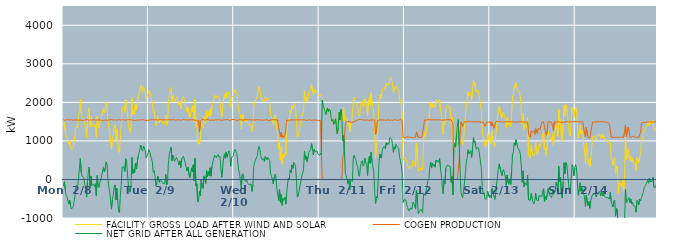
| Category | FACILITY GROSS LOAD AFTER WIND AND SOLAR | COGEN PRODUCTION | NET GRID AFTER ALL GENERATION |
|---|---|---|---|
|  Mon  2/8 | 1379 | 1553 | -174 |
|  Mon  2/8 | 1480 | 1535 | -55 |
|  Mon  2/8 | 1272 | 1531 | -259 |
|  Mon  2/8 | 1136 | 1557 | -421 |
|  Mon  2/8 | 1092 | 1541 | -449 |
|  Mon  2/8 | 1010 | 1545 | -535 |
|  Mon  2/8 | 920 | 1555 | -635 |
|  Mon  2/8 | 1010 | 1546 | -536 |
|  Mon  2/8 | 850 | 1536 | -686 |
|  Mon  2/8 | 784 | 1550 | -766 |
|  Mon  2/8 | 798 | 1537 | -739 |
|  Mon  2/8 | 828 | 1534 | -706 |
|  Mon  2/8 | 973 | 1539 | -566 |
|  Mon  2/8 | 1138 | 1548 | -410 |
|  Mon  2/8 | 1354 | 1543 | -189 |
|  Mon  2/8 | 1389 | 1541 | -152 |
|  Mon  2/8 | 1340 | 1537 | -197 |
|  Mon  2/8 | 1328 | 1538 | -210 |
|  Mon  2/8 | 1835 | 1543 | 292 |
|  Mon  2/8 | 2080 | 1539 | 541 |
|  Mon  2/8 | 1721 | 1541 | 180 |
|  Mon  2/8 | 1622 | 1533 | 89 |
|  Mon  2/8 | 1616 | 1546 | 70 |
|  Mon  2/8 | 1577 | 1534 | 43 |
|  Mon  2/8 | 1405 | 1535 | -130 |
|  Mon  2/8 | 1327 | 1550 | -223 |
|  Mon  2/8 | 1082 | 1540 | -458 |
|  Mon  2/8 | 1476 | 1552 | -76 |
|  Mon  2/8 | 1740 | 1553 | 187 |
|  Mon  2/8 | 1849 | 1528 | 321 |
|  Mon  2/8 | 1372 | 1555 | -183 |
|  Mon  2/8 | 1627 | 1546 | 81 |
|  Mon  2/8 | 1375 | 1535 | -160 |
|  Mon  2/8 | 1396 | 1543 | -147 |
|  Mon  2/8 | 1431 | 1554 | -123 |
|  Mon  2/8 | 1364 | 1547 | -183 |
|  Mon  2/8 | 1428 | 1537 | -109 |
|  Mon  2/8 | 1096 | 1527 | -431 |
|  Mon  2/8 | 1643 | 1541 | 102 |
|  Mon  2/8 | 1372 | 1534 | -162 |
|  Mon  2/8 | 1335 | 1546 | -211 |
|  Mon  2/8 | 1461 | 1543 | -82 |
|  Mon  2/8 | 1531 | 1540 | -9 |
|  Mon  2/8 | 1669 | 1556 | 113 |
|  Mon  2/8 | 1724 | 1530 | 194 |
|  Mon  2/8 | 1847 | 1541 | 306 |
|  Mon  2/8 | 1735 | 1540 | 195 |
|  Mon  2/8 | 1843 | 1542 | 301 |
|  Mon  2/8 | 1996 | 1540 | 456 |
|  Mon  2/8 | 1912 | 1540 | 372 |
|  Mon  2/8 | 1551 | 1536 | 15 |
|  Mon  2/8 | 1358 | 1554 | -196 |
|  Mon  2/8 | 1243 | 1547 | -304 |
|  Mon  2/8 | 996 | 1547 | -551 |
|  Mon  2/8 | 781 | 1552 | -771 |
|  Mon  2/8 | 1016 | 1539 | -523 |
|  Mon  2/8 | 1131 | 1541 | -410 |
|  Mon  2/8 | 1335 | 1536 | -201 |
|  Mon  2/8 | 1406 | 1547 | -141 |
|  Mon  2/8 | 1015 | 1545 | -530 |
|  Mon  2/8 | 1308 | 1536 | -228 |
|  Mon  2/8 | 996 | 1543 | -547 |
|  Mon  2/8 | 732 | 1555 | -823 |
|  Mon  2/8 | 691 | 1549 | -858 |
|  Mon  2/8 | 1128 | 1541 | -413 |
|  Mon  2/8 | 1404 | 1537 | -133 |
|  Mon  2/8 | 1860 | 1549 | 311 |
|  Mon  2/8 | 1869 | 1550 | 319 |
|  Mon  2/8 | 1883 | 1547 | 336 |
|  Mon  2/8 | 1744 | 1540 | 204 |
|  Mon  2/8 | 2075 | 1536 | 539 |
|  Mon  2/8 | 1993 | 1539 | 454 |
|  Mon  2/8 | 1999 | 1551 | 448 |
|  Mon  2/8 | 1416 | 1541 | -125 |
|  Mon  2/8 | 1419 | 1551 | -132 |
|  Mon  2/8 | 1219 | 1547 | -328 |
|  Mon  2/8 | 1371 | 1545 | -174 |
|  Mon  2/8 | 2116 | 1543 | 573 |
|  Mon  2/8 | 1685 | 1542 | 143 |
|  Mon  2/8 | 1796 | 1541 | 255 |
|  Mon  2/8 | 1699 | 1530 | 169 |
|  Mon  2/8 | 1960 | 1547 | 413 |
|  Mon  2/8 | 1810 | 1534 | 276 |
|  Mon  2/8 | 1808 | 1547 | 261 |
|  Mon  2/8 | 2143 | 1546 | 597 |
|  Mon  2/8 | 2136 | 1531 | 605 |
|  Mon  2/8 | 2323 | 1539 | 784 |
|  Mon  2/8 | 2440 | 1547 | 893 |
|  Mon  2/8 | 2339 | 1549 | 790 |
|  Mon  2/8 | 2261 | 1529 | 732 |
|  Mon  2/8 | 2412 | 1547 | 865 |
|  Mon  2/8 | 2355 | 1553 | 802 |
|  Mon  2/8 | 2275 | 1535 | 740 |
|  Mon  2/8 | 2111 | 1551 | 560 |
|  Mon  2/8 | 2110 | 1531 | 579 |
|  Mon  2/8 | 2202 | 1540 | 662 |
|  Tue  2/9 | 2317 | 1540 | 777 |
|  Tue  2/9 | 2267 | 1557 | 710 |
|  Tue  2/9 | 2254 | 1545 | 709 |
|  Tue  2/9 | 2094 | 1546 | 548 |
|  Tue  2/9 | 2004 | 1552 | 452 |
|  Tue  2/9 | 1727 | 1541 | 186 |
|  Tue  2/9 | 1776 | 1549 | 227 |
|  Tue  2/9 | 1618 | 1543 | 75 |
|  Tue  2/9 | 1388 | 1551 | -163 |
|  Tue  2/9 | 1447 | 1538 | -91 |
|  Tue  2/9 | 1632 | 1543 | 89 |
|  Tue  2/9 | 1642 | 1548 | 94 |
|  Tue  2/9 | 1474 | 1550 | -76 |
|  Tue  2/9 | 1539 | 1545 | -6 |
|  Tue  2/9 | 1517 | 1549 | -32 |
|  Tue  2/9 | 1510 | 1541 | -31 |
|  Tue  2/9 | 1439 | 1547 | -108 |
|  Tue  2/9 | 1460 | 1545 | -85 |
|  Tue  2/9 | 1451 | 1550 | -99 |
|  Tue  2/9 | 1669 | 1539 | 130 |
|  Tue  2/9 | 1400 | 1543 | -143 |
|  Tue  2/9 | 1448 | 1536 | -88 |
|  Tue  2/9 | 1955 | 1548 | 407 |
|  Tue  2/9 | 2182 | 1536 | 646 |
|  Tue  2/9 | 2181 | 1551 | 630 |
|  Tue  2/9 | 2385 | 1554 | 831 |
|  Tue  2/9 | 2028 | 1544 | 484 |
|  Tue  2/9 | 2179 | 1543 | 636 |
|  Tue  2/9 | 2094 | 1558 | 536 |
|  Tue  2/9 | 2009 | 1539 | 470 |
|  Tue  2/9 | 2014 | 1535 | 479 |
|  Tue  2/9 | 2114 | 1540 | 574 |
|  Tue  2/9 | 2144 | 1547 | 597 |
|  Tue  2/9 | 1998 | 1535 | 463 |
|  Tue  2/9 | 1924 | 1549 | 375 |
|  Tue  2/9 | 2025 | 1541 | 484 |
|  Tue  2/9 | 1845 | 1536 | 309 |
|  Tue  2/9 | 2077 | 1538 | 539 |
|  Tue  2/9 | 2110 | 1554 | 556 |
|  Tue  2/9 | 2149 | 1544 | 605 |
|  Tue  2/9 | 2131 | 1550 | 581 |
|  Tue  2/9 | 1961 | 1542 | 419 |
|  Tue  2/9 | 1982 | 1545 | 437 |
|  Tue  2/9 | 1754 | 1537 | 217 |
|  Tue  2/9 | 1864 | 1540 | 324 |
|  Tue  2/9 | 1850 | 1536 | 314 |
|  Tue  2/9 | 1590 | 1548 | 42 |
|  Tue  2/9 | 1690 | 1543 | 147 |
|  Tue  2/9 | 1845 | 1544 | 301 |
|  Tue  2/9 | 1756 | 1554 | 202 |
|  Tue  2/9 | 1930 | 1548 | 382 |
|  Tue  2/9 | 1499 | 1538 | -39 |
|  Tue  2/9 | 2088 | 1537 | 551 |
|  Tue  2/9 | 1386 | 1548 | -162 |
|  Tue  2/9 | 1413 | 1525 | -112 |
|  Tue  2/9 | 904 | 1491 | -587 |
|  Tue  2/9 | 1026 | 1535 | -509 |
|  Tue  2/9 | 928 | 1239 | -311 |
|  Tue  2/9 | 1082 | 1499 | -417 |
|  Tue  2/9 | 1524 | 1541 | -17 |
|  Tue  2/9 | 1376 | 1543 | -167 |
|  Tue  2/9 | 1331 | 1560 | -229 |
|  Tue  2/9 | 1633 | 1540 | 93 |
|  Tue  2/9 | 1531 | 1537 | -6 |
|  Tue  2/9 | 1443 | 1548 | -105 |
|  Tue  2/9 | 1783 | 1554 | 229 |
|  Tue  2/9 | 1619 | 1550 | 69 |
|  Tue  2/9 | 1761 | 1552 | 209 |
|  Tue  2/9 | 1640 | 1539 | 101 |
|  Tue  2/9 | 1836 | 1533 | 303 |
|  Tue  2/9 | 1637 | 1552 | 85 |
|  Tue  2/9 | 1899 | 1543 | 356 |
|  Tue  2/9 | 1985 | 1530 | 455 |
|  Tue  2/9 | 2073 | 1531 | 542 |
|  Tue  2/9 | 2185 | 1553 | 632 |
|  Tue  2/9 | 2137 | 1549 | 588 |
|  Tue  2/9 | 2108 | 1549 | 559 |
|  Tue  2/9 | 2170 | 1547 | 623 |
|  Tue  2/9 | 2188 | 1537 | 651 |
|  Tue  2/9 | 2132 | 1551 | 581 |
|  Tue  2/9 | 2149 | 1542 | 607 |
|  Tue  2/9 | 1853 | 1535 | 318 |
|  Tue  2/9 | 1605 | 1546 | 59 |
|  Tue  2/9 | 1829 | 1539 | 290 |
|  Tue  2/9 | 2073 | 1536 | 537 |
|  Tue  2/9 | 2212 | 1549 | 663 |
|  Tue  2/9 | 2093 | 1545 | 548 |
|  Tue  2/9 | 2264 | 1549 | 715 |
|  Tue  2/9 | 2123 | 1545 | 578 |
|  Tue  2/9 | 2212 | 1556 | 656 |
|  Tue  2/9 | 2281 | 1542 | 739 |
|  Tue  2/9 | 2222 | 1526 | 696 |
|  Tue  2/9 | 1871 | 1528 | 343 |
|  Tue  2/9 | 2123 | 1555 | 568 |
|  Tue  2/9 | 2114 | 1539 | 575 |
|  Tue  2/9 | 2161 | 1556 | 605 |
|  Wed  2/10 | 2282 | 1550 | 732 |
|  Wed  2/10 | 2340 | 1560 | 780 |
|  Wed  2/10 | 2316 | 1533 | 783 |
|  Wed  2/10 | 2226 | 1553 | 673 |
|  Wed  2/10 | 2007 | 1538 | 469 |
|  Wed  2/10 | 1795 | 1541 | 254 |
|  Wed  2/10 | 1711 | 1554 | 157 |
|  Wed  2/10 | 1678 | 1542 | 136 |
|  Wed  2/10 | 1309 | 1545 | -236 |
|  Wed  2/10 | 1666 | 1541 | 125 |
|  Wed  2/10 | 1699 | 1543 | 156 |
|  Wed  2/10 | 1555 | 1545 | 10 |
|  Wed  2/10 | 1536 | 1550 | -14 |
|  Wed  2/10 | 1493 | 1545 | -52 |
|  Wed  2/10 | 1562 | 1556 | 6 |
|  Wed  2/10 | 1456 | 1552 | -96 |
|  Wed  2/10 | 1460 | 1545 | -85 |
|  Wed  2/10 | 1413 | 1552 | -139 |
|  Wed  2/10 | 1398 | 1559 | -161 |
|  Wed  2/10 | 1416 | 1533 | -117 |
|  Wed  2/10 | 1242 | 1552 | -310 |
|  Wed  2/10 | 1397 | 1551 | -154 |
|  Wed  2/10 | 1881 | 1545 | 336 |
|  Wed  2/10 | 1982 | 1538 | 444 |
|  Wed  2/10 | 2058 | 1550 | 508 |
|  Wed  2/10 | 2072 | 1553 | 519 |
|  Wed  2/10 | 2156 | 1545 | 611 |
|  Wed  2/10 | 2316 | 1541 | 775 |
|  Wed  2/10 | 2410 | 1554 | 856 |
|  Wed  2/10 | 2326 | 1548 | 778 |
|  Wed  2/10 | 2134 | 1531 | 603 |
|  Wed  2/10 | 2055 | 1541 | 514 |
|  Wed  2/10 | 2066 | 1533 | 533 |
|  Wed  2/10 | 2075 | 1535 | 540 |
|  Wed  2/10 | 2012 | 1542 | 470 |
|  Wed  2/10 | 2141 | 1545 | 596 |
|  Wed  2/10 | 2105 | 1541 | 564 |
|  Wed  2/10 | 2059 | 1550 | 509 |
|  Wed  2/10 | 2114 | 1548 | 566 |
|  Wed  2/10 | 2068 | 1527 | 541 |
|  Wed  2/10 | 2010 | 1526 | 484 |
|  Wed  2/10 | 1675 | 1540 | 135 |
|  Wed  2/10 | 1613 | 1536 | 77 |
|  Wed  2/10 | 1544 | 1552 | -8 |
|  Wed  2/10 | 1422 | 1538 | -116 |
|  Wed  2/10 | 1600 | 1550 | 50 |
|  Wed  2/10 | 1680 | 1543 | 137 |
|  Wed  2/10 | 1594 | 1546 | 48 |
|  Wed  2/10 | 1302 | 1548 | -246 |
|  Wed  2/10 | 1167 | 1547 | -380 |
|  Wed  2/10 | 795 | 1341 | -546 |
|  Wed  2/10 | 989 | 1243 | -254 |
|  Wed  2/10 | 503 | 1100 | -597 |
|  Wed  2/10 | 843 | 1225 | -382 |
|  Wed  2/10 | 416 | 1088 | -672 |
|  Wed  2/10 | 636 | 1132 | -496 |
|  Wed  2/10 | 577 | 1101 | -524 |
|  Wed  2/10 | 691 | 1151 | -460 |
|  Wed  2/10 | 632 | 1272 | -640 |
|  Wed  2/10 | 1165 | 1540 | -375 |
|  Wed  2/10 | 1426 | 1542 | -116 |
|  Wed  2/10 | 1576 | 1537 | 39 |
|  Wed  2/10 | 1548 | 1550 | -2 |
|  Wed  2/10 | 1788 | 1540 | 248 |
|  Wed  2/10 | 1722 | 1544 | 178 |
|  Wed  2/10 | 1924 | 1547 | 377 |
|  Wed  2/10 | 1823 | 1535 | 288 |
|  Wed  2/10 | 1982 | 1543 | 439 |
|  Wed  2/10 | 1943 | 1550 | 393 |
|  Wed  2/10 | 1886 | 1545 | 341 |
|  Wed  2/10 | 1538 | 1547 | -9 |
|  Wed  2/10 | 1087 | 1547 | -460 |
|  Wed  2/10 | 1121 | 1552 | -431 |
|  Wed  2/10 | 1113 | 1546 | -433 |
|  Wed  2/10 | 1380 | 1544 | -164 |
|  Wed  2/10 | 1402 | 1545 | -143 |
|  Wed  2/10 | 1628 | 1546 | 82 |
|  Wed  2/10 | 1640 | 1545 | 95 |
|  Wed  2/10 | 1781 | 1538 | 243 |
|  Wed  2/10 | 2286 | 1547 | 739 |
|  Wed  2/10 | 2053 | 1532 | 521 |
|  Wed  2/10 | 2144 | 1537 | 607 |
|  Wed  2/10 | 2011 | 1547 | 464 |
|  Wed  2/10 | 2118 | 1536 | 582 |
|  Wed  2/10 | 2254 | 1552 | 702 |
|  Wed  2/10 | 2255 | 1549 | 706 |
|  Wed  2/10 | 2329 | 1552 | 777 |
|  Wed  2/10 | 2460 | 1533 | 927 |
|  Wed  2/10 | 2335 | 1549 | 786 |
|  Wed  2/10 | 2180 | 1543 | 637 |
|  Wed  2/10 | 2333 | 1550 | 783 |
|  Wed  2/10 | 2263 | 1537 | 726 |
|  Wed  2/10 | 2283 | 1552 | 731 |
|  Wed  2/10 | 2281 | 1540 | 741 |
|  Wed  2/10 | 2208 | 1543 | 665 |
|  Wed  2/10 | 2176 | 1528 | 648 |
|  Thu  2/11 | 2168 | 1549 | 619 |
|  Thu  2/11 | 2210 | 1532 | 678 |
|  Thu  2/11 | 2163 | 1523 | 640 |
|  Thu  2/11 | 2058 | 0 | 2058 |
|  Thu  2/11 | 1917 | 0 | 1917 |
|  Thu  2/11 | 1895 | 0 | 1895 |
|  Thu  2/11 | 1784 | 0 | 1784 |
|  Thu  2/11 | 1682 | 0 | 1682 |
|  Thu  2/11 | 1678 | 0 | 1678 |
|  Thu  2/11 | 1855 | 0 | 1855 |
|  Thu  2/11 | 1750 | 0 | 1750 |
|  Thu  2/11 | 1824 | 0 | 1824 |
|  Thu  2/11 | 1798 | 0 | 1798 |
|  Thu  2/11 | 1606 | 0 | 1606 |
|  Thu  2/11 | 1506 | 0 | 1506 |
|  Thu  2/11 | 1562 | 0 | 1562 |
|  Thu  2/11 | 1431 | 0 | 1431 |
|  Thu  2/11 | 1502 | 0 | 1502 |
|  Thu  2/11 | 1580 | 0 | 1580 |
|  Thu  2/11 | 1602 | 0 | 1602 |
|  Thu  2/11 | 1181 | 0 | 1181 |
|  Thu  2/11 | 1351 | 0 | 1351 |
|  Thu  2/11 | 1746 | 0 | 1746 |
|  Thu  2/11 | 1540 | 0 | 1540 |
|  Thu  2/11 | 1815 | 0 | 1815 |
|  Thu  2/11 | 1699 | 0 | 1699 |
|  Thu  2/11 | 1507 | 500 | 1007 |
|  Thu  2/11 | 1879 | 745 | 1134 |
|  Thu  2/11 | 1523 | 744 | 779 |
|  Thu  2/11 | 1600 | 1438 | 162 |
|  Thu  2/11 | 1591 | 1493 | 98 |
|  Thu  2/11 | 1595 | 1487 | 108 |
|  Thu  2/11 | 1387 | 1497 | -110 |
|  Thu  2/11 | 1471 | 1477 | -6 |
|  Thu  2/11 | 1235 | 1495 | -260 |
|  Thu  2/11 | 1464 | 1497 | -33 |
|  Thu  2/11 | 1426 | 1481 | -55 |
|  Thu  2/11 | 1443 | 1492 | -49 |
|  Thu  2/11 | 2082 | 1494 | 588 |
|  Thu  2/11 | 2126 | 1496 | 630 |
|  Thu  2/11 | 2048 | 1505 | 543 |
|  Thu  2/11 | 1994 | 1490 | 504 |
|  Thu  2/11 | 1920 | 1538 | 382 |
|  Thu  2/11 | 1846 | 1530 | 316 |
|  Thu  2/11 | 1665 | 1548 | 117 |
|  Thu  2/11 | 1628 | 1549 | 79 |
|  Thu  2/11 | 1897 | 1558 | 339 |
|  Thu  2/11 | 1993 | 1548 | 445 |
|  Thu  2/11 | 2035 | 1548 | 487 |
|  Thu  2/11 | 1884 | 1542 | 342 |
|  Thu  2/11 | 1920 | 1539 | 381 |
|  Thu  2/11 | 2103 | 1548 | 555 |
|  Thu  2/11 | 1967 | 1538 | 429 |
|  Thu  2/11 | 1940 | 1545 | 395 |
|  Thu  2/11 | 1649 | 1545 | 104 |
|  Thu  2/11 | 2017 | 1536 | 481 |
|  Thu  2/11 | 2139 | 1532 | 607 |
|  Thu  2/11 | 1945 | 1529 | 416 |
|  Thu  2/11 | 2246 | 1543 | 703 |
|  Thu  2/11 | 1994 | 1538 | 456 |
|  Thu  2/11 | 1875 | 1542 | 333 |
|  Thu  2/11 | 1714 | 1543 | 171 |
|  Thu  2/11 | 1243 | 1548 | -305 |
|  Thu  2/11 | 540 | 1164 | -624 |
|  Thu  2/11 | 795 | 1240 | -445 |
|  Thu  2/11 | 1041 | 1521 | -480 |
|  Thu  2/11 | 1580 | 1546 | 34 |
|  Thu  2/11 | 2031 | 1541 | 490 |
|  Thu  2/11 | 2205 | 1545 | 660 |
|  Thu  2/11 | 2103 | 1547 | 556 |
|  Thu  2/11 | 2219 | 1560 | 659 |
|  Thu  2/11 | 2349 | 1542 | 807 |
|  Thu  2/11 | 2371 | 1540 | 831 |
|  Thu  2/11 | 2403 | 1543 | 860 |
|  Thu  2/11 | 2336 | 1537 | 799 |
|  Thu  2/11 | 2486 | 1535 | 951 |
|  Thu  2/11 | 2439 | 1542 | 897 |
|  Thu  2/11 | 2498 | 1549 | 949 |
|  Thu  2/11 | 2456 | 1542 | 914 |
|  Thu  2/11 | 2623 | 1535 | 1088 |
|  Thu  2/11 | 2654 | 1546 | 1108 |
|  Thu  2/11 | 2582 | 1538 | 1044 |
|  Thu  2/11 | 2475 | 1542 | 933 |
|  Thu  2/11 | 2241 | 1536 | 705 |
|  Thu  2/11 | 2394 | 1546 | 848 |
|  Thu  2/11 | 2340 | 1553 | 787 |
|  Thu  2/11 | 2439 | 1530 | 909 |
|  Thu  2/11 | 2393 | 1535 | 858 |
|  Thu  2/11 | 2371 | 1543 | 828 |
|  Thu  2/11 | 2333 | 1537 | 796 |
|  Thu  2/11 | 2118 | 1550 | 568 |
|  Thu  2/11 | 2039 | 1553 | 486 |
|  Thu  2/11 | 1895 | 1543 | 352 |
|  Thu  2/11 | 1669 | 1530 | 139 |
|  Thu  2/11 | 496 | 1093 | -597 |
|  Thu  2/11 | 563 | 1092 | -529 |
|  Fri  2/12 | 546 | 1085 | -539 |
|  Fri  2/12 | 555 | 1085 | -530 |
|  Fri  2/12 | 457 | 1105 | -648 |
|  Fri  2/12 | 371 | 1096 | -725 |
|  Fri  2/12 | 312 | 1102 | -790 |
|  Fri  2/12 | 272 | 1091 | -819 |
|  Fri  2/12 | 349 | 1091 | -742 |
|  Fri  2/12 | 353 | 1089 | -736 |
|  Fri  2/12 | 316 | 1091 | -775 |
|  Fri  2/12 | 503 | 1088 | -585 |
|  Fri  2/12 | 462 | 1079 | -617 |
|  Fri  2/12 | 462 | 1101 | -639 |
|  Fri  2/12 | 327 | 1090 | -763 |
|  Fri  2/12 | 943 | 1232 | -289 |
|  Fri  2/12 | 747 | 1222 | -475 |
|  Fri  2/12 | 218 | 1100 | -882 |
|  Fri  2/12 | 259 | 1095 | -836 |
|  Fri  2/12 | 231 | 1088 | -857 |
|  Fri  2/12 | 308 | 1081 | -773 |
|  Fri  2/12 | 301 | 1097 | -796 |
|  Fri  2/12 | 243 | 1097 | -854 |
|  Fri  2/12 | 990 | 1348 | -358 |
|  Fri  2/12 | 1207 | 1548 | -341 |
|  Fri  2/12 | 1122 | 1541 | -419 |
|  Fri  2/12 | 1127 | 1538 | -411 |
|  Fri  2/12 | 1398 | 1545 | -147 |
|  Fri  2/12 | 1542 | 1553 | -11 |
|  Fri  2/12 | 1570 | 1542 | 28 |
|  Fri  2/12 | 1861 | 1549 | 312 |
|  Fri  2/12 | 2000 | 1551 | 449 |
|  Fri  2/12 | 1843 | 1547 | 296 |
|  Fri  2/12 | 1965 | 1542 | 423 |
|  Fri  2/12 | 1897 | 1550 | 347 |
|  Fri  2/12 | 1938 | 1549 | 389 |
|  Fri  2/12 | 1865 | 1547 | 318 |
|  Fri  2/12 | 2056 | 1552 | 504 |
|  Fri  2/12 | 2005 | 1546 | 459 |
|  Fri  2/12 | 2035 | 1542 | 493 |
|  Fri  2/12 | 1989 | 1549 | 440 |
|  Fri  2/12 | 2076 | 1531 | 545 |
|  Fri  2/12 | 1840 | 1543 | 297 |
|  Fri  2/12 | 1634 | 1539 | 95 |
|  Fri  2/12 | 1369 | 1539 | -170 |
|  Fri  2/12 | 1163 | 1537 | -374 |
|  Fri  2/12 | 1515 | 1542 | -27 |
|  Fri  2/12 | 1433 | 1544 | -111 |
|  Fri  2/12 | 1831 | 1543 | 288 |
|  Fri  2/12 | 1823 | 1548 | 275 |
|  Fri  2/12 | 1932 | 1553 | 379 |
|  Fri  2/12 | 1892 | 1542 | 350 |
|  Fri  2/12 | 1887 | 1547 | 340 |
|  Fri  2/12 | 1869 | 1535 | 334 |
|  Fri  2/12 | 1476 | 1551 | -75 |
|  Fri  2/12 | 1617 | 1541 | 76 |
|  Fri  2/12 | 1052 | 1450 | -398 |
|  Fri  2/12 | 811 | 0 | 811 |
|  Fri  2/12 | 934 | 0 | 934 |
|  Fri  2/12 | 836 | 0 | 836 |
|  Fri  2/12 | 1145 | 0 | 1145 |
|  Fri  2/12 | 1378 | 0 | 1378 |
|  Fri  2/12 | 1551 | 0 | 1551 |
|  Fri  2/12 | 1384 | 488 | 896 |
|  Fri  2/12 | 1374 | 1091 | 283 |
|  Fri  2/12 | 1164 | 1493 | -329 |
|  Fri  2/12 | 1079 | 1499 | -420 |
|  Fri  2/12 | 914 | 1382 | -468 |
|  Fri  2/12 | 1003 | 1452 | -449 |
|  Fri  2/12 | 1419 | 1502 | -83 |
|  Fri  2/12 | 1644 | 1496 | 148 |
|  Fri  2/12 | 1921 | 1488 | 433 |
|  Fri  2/12 | 2055 | 1496 | 559 |
|  Fri  2/12 | 2277 | 1506 | 771 |
|  Fri  2/12 | 2162 | 1495 | 667 |
|  Fri  2/12 | 2218 | 1502 | 716 |
|  Fri  2/12 | 2248 | 1506 | 742 |
|  Fri  2/12 | 2063 | 1494 | 569 |
|  Fri  2/12 | 2290 | 1497 | 793 |
|  Fri  2/12 | 2583 | 1497 | 1086 |
|  Fri  2/12 | 2433 | 1492 | 941 |
|  Fri  2/12 | 2490 | 1499 | 991 |
|  Fri  2/12 | 2279 | 1495 | 784 |
|  Fri  2/12 | 2256 | 1481 | 775 |
|  Fri  2/12 | 2322 | 1489 | 833 |
|  Fri  2/12 | 2309 | 1515 | 794 |
|  Fri  2/12 | 2119 | 1484 | 635 |
|  Fri  2/12 | 2121 | 1482 | 639 |
|  Fri  2/12 | 1764 | 1485 | 279 |
|  Fri  2/12 | 1278 | 1496 | -218 |
|  Fri  2/12 | 1111 | 1493 | -382 |
|  Fri  2/12 | 1096 | 1438 | -342 |
|  Fri  2/12 | 886 | 1375 | -489 |
|  Fri  2/12 | 832 | 1354 | -522 |
|  Fri  2/12 | 1002 | 1490 | -488 |
|  Fri  2/12 | 1199 | 1502 | -303 |
|  Fri  2/12 | 1201 | 1487 | -286 |
|  Fri  2/12 | 1012 | 1475 | -463 |
|  Sat  2/13 | 1090 | 1494 | -404 |
|  Sat  2/13 | 916 | 1397 | -481 |
|  Sat  2/13 | 1256 | 1491 | -235 |
|  Sat  2/13 | 1258 | 1478 | -220 |
|  Sat  2/13 | 914 | 1329 | -415 |
|  Sat  2/13 | 841 | 1356 | -515 |
|  Sat  2/13 | 1093 | 1497 | -404 |
|  Sat  2/13 | 1080 | 1492 | -412 |
|  Sat  2/13 | 1577 | 1509 | 68 |
|  Sat  2/13 | 1747 | 1489 | 258 |
|  Sat  2/13 | 1903 | 1499 | 404 |
|  Sat  2/13 | 1916 | 1492 | 424 |
|  Sat  2/13 | 1695 | 1493 | 202 |
|  Sat  2/13 | 1595 | 1495 | 100 |
|  Sat  2/13 | 1703 | 1491 | 212 |
|  Sat  2/13 | 1749 | 1493 | 256 |
|  Sat  2/13 | 1655 | 1495 | 160 |
|  Sat  2/13 | 1547 | 1483 | 64 |
|  Sat  2/13 | 1341 | 1494 | -153 |
|  Sat  2/13 | 1603 | 1486 | 117 |
|  Sat  2/13 | 1412 | 1499 | -87 |
|  Sat  2/13 | 1393 | 1516 | -123 |
|  Sat  2/13 | 1506 | 1491 | 15 |
|  Sat  2/13 | 1368 | 1497 | -129 |
|  Sat  2/13 | 1717 | 1496 | 221 |
|  Sat  2/13 | 2133 | 1499 | 634 |
|  Sat  2/13 | 2218 | 1496 | 722 |
|  Sat  2/13 | 2435 | 1490 | 945 |
|  Sat  2/13 | 2365 | 1482 | 883 |
|  Sat  2/13 | 2501 | 1475 | 1026 |
|  Sat  2/13 | 2401 | 1490 | 911 |
|  Sat  2/13 | 2313 | 1495 | 818 |
|  Sat  2/13 | 2309 | 1492 | 817 |
|  Sat  2/13 | 2225 | 1488 | 737 |
|  Sat  2/13 | 2132 | 1500 | 632 |
|  Sat  2/13 | 1752 | 1488 | 264 |
|  Sat  2/13 | 1423 | 1498 | -75 |
|  Sat  2/13 | 1713 | 1486 | 227 |
|  Sat  2/13 | 1285 | 1481 | -196 |
|  Sat  2/13 | 1409 | 1498 | -89 |
|  Sat  2/13 | 1395 | 1495 | -100 |
|  Sat  2/13 | 1348 | 1501 | -153 |
|  Sat  2/13 | 1608 | 1493 | 115 |
|  Sat  2/13 | 653 | 1182 | -529 |
|  Sat  2/13 | 598 | 1125 | -527 |
|  Sat  2/13 | 557 | 1098 | -541 |
|  Sat  2/13 | 895 | 1258 | -363 |
|  Sat  2/13 | 726 | 1222 | -496 |
|  Sat  2/13 | 634 | 1208 | -574 |
|  Sat  2/13 | 635 | 1269 | -634 |
|  Sat  2/13 | 620 | 1174 | -554 |
|  Sat  2/13 | 961 | 1318 | -357 |
|  Sat  2/13 | 796 | 1327 | -531 |
|  Sat  2/13 | 650 | 1193 | -543 |
|  Sat  2/13 | 774 | 1326 | -552 |
|  Sat  2/13 | 905 | 1315 | -410 |
|  Sat  2/13 | 847 | 1294 | -447 |
|  Sat  2/13 | 986 | 1405 | -419 |
|  Sat  2/13 | 1036 | 1488 | -452 |
|  Sat  2/13 | 1196 | 1500 | -304 |
|  Sat  2/13 | 1256 | 1496 | -240 |
|  Sat  2/13 | 778 | 1350 | -572 |
|  Sat  2/13 | 818 | 1262 | -444 |
|  Sat  2/13 | 628 | 1147 | -519 |
|  Sat  2/13 | 864 | 1249 | -385 |
|  Sat  2/13 | 1258 | 1498 | -240 |
|  Sat  2/13 | 1130 | 1487 | -357 |
|  Sat  2/13 | 1082 | 1494 | -412 |
|  Sat  2/13 | 1084 | 1490 | -406 |
|  Sat  2/13 | 1015 | 1485 | -470 |
|  Sat  2/13 | 1183 | 1493 | -310 |
|  Sat  2/13 | 881 | 1266 | -385 |
|  Sat  2/13 | 1165 | 1496 | -331 |
|  Sat  2/13 | 1188 | 1490 | -302 |
|  Sat  2/13 | 1415 | 1487 | -72 |
|  Sat  2/13 | 1324 | 1484 | -160 |
|  Sat  2/13 | 1115 | 1501 | -386 |
|  Sat  2/13 | 1827 | 1487 | 340 |
|  Sat  2/13 | 1436 | 1486 | -50 |
|  Sat  2/13 | 1553 | 1504 | 49 |
|  Sat  2/13 | 1108 | 1486 | -378 |
|  Sat  2/13 | 1009 | 1491 | -482 |
|  Sat  2/13 | 1417 | 1478 | -61 |
|  Sat  2/13 | 1932 | 1497 | 435 |
|  Sat  2/13 | 1638 | 1489 | 149 |
|  Sat  2/13 | 1936 | 1497 | 439 |
|  Sat  2/13 | 1881 | 1502 | 379 |
|  Sat  2/13 | 1860 | 1491 | 369 |
|  Sat  2/13 | 1397 | 1488 | -91 |
|  Sat  2/13 | 1156 | 1494 | -338 |
|  Sat  2/13 | 1122 | 1495 | -373 |
|  Sat  2/13 | 1544 | 1498 | 46 |
|  Sat  2/13 | 1873 | 1493 | 380 |
|  Sat  2/13 | 1800 | 1479 | 321 |
|  Sat  2/13 | 1590 | 1501 | 89 |
|  Sat  2/13 | 1783 | 1491 | 292 |
|  Sun  2/14 | 1877 | 1494 | 383 |
|  Sun  2/14 | 1782 | 1480 | 302 |
|  Sun  2/14 | 1415 | 1504 | -89 |
|  Sun  2/14 | 1085 | 1494 | -409 |
|  Sun  2/14 | 1237 | 1488 | -251 |
|  Sun  2/14 | 1408 | 1495 | -87 |
|  Sun  2/14 | 1188 | 1494 | -306 |
|  Sun  2/14 | 1275 | 1489 | -214 |
|  Sun  2/14 | 1194 | 1498 | -304 |
|  Sun  2/14 | 1202 | 1490 | -288 |
|  Sun  2/14 | 729 | 1171 | -442 |
|  Sun  2/14 | 399 | 1101 | -702 |
|  Sun  2/14 | 942 | 1360 | -418 |
|  Sun  2/14 | 751 | 1189 | -438 |
|  Sun  2/14 | 412 | 1088 | -676 |
|  Sun  2/14 | 525 | 1102 | -577 |
|  Sun  2/14 | 336 | 1083 | -747 |
|  Sun  2/14 | 547 | 1098 | -551 |
|  Sun  2/14 | 809 | 1357 | -548 |
|  Sun  2/14 | 1106 | 1492 | -386 |
|  Sun  2/14 | 1113 | 1484 | -371 |
|  Sun  2/14 | 1105 | 1489 | -384 |
|  Sun  2/14 | 1142 | 1491 | -349 |
|  Sun  2/14 | 1037 | 1496 | -459 |
|  Sun  2/14 | 1063 | 1498 | -435 |
|  Sun  2/14 | 1152 | 1491 | -339 |
|  Sun  2/14 | 1160 | 1491 | -331 |
|  Sun  2/14 | 1182 | 1496 | -314 |
|  Sun  2/14 | 1065 | 1486 | -421 |
|  Sun  2/14 | 1155 | 1494 | -339 |
|  Sun  2/14 | 1078 | 1502 | -424 |
|  Sun  2/14 | 1167 | 1496 | -329 |
|  Sun  2/14 | 1067 | 1497 | -430 |
|  Sun  2/14 | 1054 | 1491 | -437 |
|  Sun  2/14 | 1007 | 1478 | -471 |
|  Sun  2/14 | 1029 | 1481 | -452 |
|  Sun  2/14 | 1021 | 1492 | -471 |
|  Sun  2/14 | 992 | 1470 | -478 |
|  Sun  2/14 | 914 | 1423 | -509 |
|  Sun  2/14 | 954 | 1286 | -332 |
|  Sun  2/14 | 526 | 1099 | -573 |
|  Sun  2/14 | 488 | 1082 | -594 |
|  Sun  2/14 | 368 | 1086 | -718 |
|  Sun  2/14 | 529 | 1095 | -566 |
|  Sun  2/14 | 571 | 1104 | -533 |
|  Sun  2/14 | 135 | 1087 | -952 |
|  Sun  2/14 | 341 | 1091 | -750 |
|  Sun  2/14 | 279 | 1086 | -807 |
|  Sun  2/14 | -357 | 1094 | -1451 |
|  Sun  2/14 | -56 | 1092 | -1148 |
|  Sun  2/14 | -114 | 1093 | -1207 |
|  Sun  2/14 | -109 | 1090 | -1199 |
|  Sun  2/14 | -205 | 1094 | -1299 |
|  Sun  2/14 | -5 | 1098 | -1103 |
|  Sun  2/14 | -293 | 1094 | -1387 |
|  Sun  2/14 | -2 | 1103 | -1105 |
|  Sun  2/14 | 1156 | 1414 | -258 |
|  Sun  2/14 | 509 | 1109 | -600 |
|  Sun  2/14 | 539 | 1089 | -550 |
|  Sun  2/14 | 795 | 1354 | -559 |
|  Sun  2/14 | 792 | 1264 | -472 |
|  Sun  2/14 | 490 | 1094 | -604 |
|  Sun  2/14 | 596 | 1101 | -505 |
|  Sun  2/14 | 465 | 1097 | -632 |
|  Sun  2/14 | 539 | 1125 | -586 |
|  Sun  2/14 | 424 | 1109 | -685 |
|  Sun  2/14 | 416 | 1109 | -693 |
|  Sun  2/14 | 423 | 1125 | -702 |
|  Sun  2/14 | 235 | 1085 | -850 |
|  Sun  2/14 | 569 | 1111 | -542 |
|  Sun  2/14 | 515 | 1097 | -582 |
|  Sun  2/14 | 429 | 1083 | -654 |
|  Sun  2/14 | 589 | 1098 | -509 |
|  Sun  2/14 | 674 | 1228 | -554 |
|  Sun  2/14 | 978 | 1451 | -473 |
|  Sun  2/14 | 1012 | 1485 | -473 |
|  Sun  2/14 | 1142 | 1482 | -340 |
|  Sun  2/14 | 1266 | 1480 | -214 |
|  Sun  2/14 | 1300 | 1480 | -180 |
|  Sun  2/14 | 1317 | 1486 | -169 |
|  Sun  2/14 | 1411 | 1494 | -83 |
|  Sun  2/14 | 1463 | 1491 | -28 |
|  Sun  2/14 | 1391 | 1488 | -97 |
|  Sun  2/14 | 1531 | 1498 | 33 |
|  Sun  2/14 | 1445 | 1499 | -54 |
|  Sun  2/14 | 1433 | 1487 | -54 |
|  Sun  2/14 | 1440 | 1491 | -51 |
|  Sun  2/14 | 1544 | 1489 | 55 |
|  Sun  2/14 | 1290 | 1491 | -201 |
|  Sun  2/14 | 1283 | 1497 | -214 |
|  Sun  2/14 | 1284 | 1491 | -207 |
|  Sun  2/14 | 1402 | 1491 | -89 |